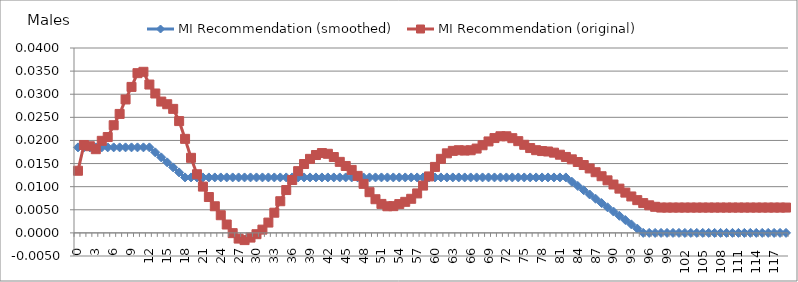
| Category | MI Recommendation (smoothed) | MI Recommendation (original)  |
|---|---|---|
| 0.0 | 0.018 | 0.013 |
| 1.0 | 0.018 | 0.019 |
| 2.0 | 0.018 | 0.019 |
| 3.0 | 0.018 | 0.018 |
| 4.0 | 0.018 | 0.02 |
| 5.0 | 0.018 | 0.021 |
| 6.0 | 0.018 | 0.023 |
| 7.0 | 0.018 | 0.026 |
| 8.0 | 0.018 | 0.029 |
| 9.0 | 0.018 | 0.032 |
| 10.0 | 0.018 | 0.035 |
| 11.0 | 0.018 | 0.035 |
| 12.0 | 0.018 | 0.032 |
| 13.0 | 0.017 | 0.03 |
| 14.0 | 0.016 | 0.028 |
| 15.0 | 0.015 | 0.028 |
| 16.0 | 0.014 | 0.027 |
| 17.0 | 0.013 | 0.024 |
| 18.0 | 0.012 | 0.02 |
| 19.0 | 0.012 | 0.016 |
| 20.0 | 0.012 | 0.013 |
| 21.0 | 0.012 | 0.01 |
| 22.0 | 0.012 | 0.008 |
| 23.0 | 0.012 | 0.006 |
| 24.0 | 0.012 | 0.004 |
| 25.0 | 0.012 | 0.002 |
| 26.0 | 0.012 | 0 |
| 27.0 | 0.012 | -0.001 |
| 28.0 | 0.012 | -0.002 |
| 29.0 | 0.012 | -0.001 |
| 30.0 | 0.012 | 0 |
| 31.0 | 0.012 | 0.001 |
| 32.0 | 0.012 | 0.002 |
| 33.0 | 0.012 | 0.004 |
| 34.0 | 0.012 | 0.007 |
| 35.0 | 0.012 | 0.009 |
| 36.0 | 0.012 | 0.011 |
| 37.0 | 0.012 | 0.013 |
| 38.0 | 0.012 | 0.015 |
| 39.0 | 0.012 | 0.016 |
| 40.0 | 0.012 | 0.017 |
| 41.0 | 0.012 | 0.017 |
| 42.0 | 0.012 | 0.017 |
| 43.0 | 0.012 | 0.016 |
| 44.0 | 0.012 | 0.015 |
| 45.0 | 0.012 | 0.014 |
| 46.0 | 0.012 | 0.014 |
| 47.0 | 0.012 | 0.012 |
| 48.0 | 0.012 | 0.011 |
| 49.0 | 0.012 | 0.009 |
| 50.0 | 0.012 | 0.007 |
| 51.0 | 0.012 | 0.006 |
| 52.0 | 0.012 | 0.006 |
| 53.0 | 0.012 | 0.006 |
| 54.0 | 0.012 | 0.006 |
| 55.0 | 0.012 | 0.007 |
| 56.0 | 0.012 | 0.007 |
| 57.0 | 0.012 | 0.009 |
| 58.0 | 0.012 | 0.01 |
| 59.0 | 0.012 | 0.012 |
| 60.0 | 0.012 | 0.014 |
| 61.0 | 0.012 | 0.016 |
| 62.0 | 0.012 | 0.017 |
| 63.0 | 0.012 | 0.018 |
| 64.0 | 0.012 | 0.018 |
| 65.0 | 0.012 | 0.018 |
| 66.0 | 0.012 | 0.018 |
| 67.0 | 0.012 | 0.018 |
| 68.0 | 0.012 | 0.019 |
| 69.0 | 0.012 | 0.02 |
| 70.0 | 0.012 | 0.021 |
| 71.0 | 0.012 | 0.021 |
| 72.0 | 0.012 | 0.021 |
| 73.0 | 0.012 | 0.02 |
| 74.0 | 0.012 | 0.02 |
| 75.0 | 0.012 | 0.019 |
| 76.0 | 0.012 | 0.018 |
| 77.0 | 0.012 | 0.018 |
| 78.0 | 0.012 | 0.018 |
| 79.0 | 0.012 | 0.018 |
| 80.0 | 0.012 | 0.017 |
| 81.0 | 0.012 | 0.017 |
| 82.0 | 0.012 | 0.016 |
| 83.0 | 0.011 | 0.016 |
| 84.0 | 0.01 | 0.015 |
| 85.0 | 0.009 | 0.015 |
| 86.0 | 0.008 | 0.014 |
| 87.0 | 0.007 | 0.013 |
| 88.0 | 0.006 | 0.012 |
| 89.0 | 0.006 | 0.011 |
| 90.0 | 0.005 | 0.01 |
| 91.0 | 0.004 | 0.01 |
| 92.0 | 0.003 | 0.009 |
| 93.0 | 0.002 | 0.008 |
| 94.0 | 0.001 | 0.007 |
| 95.0 | 0 | 0.006 |
| 96.0 | 0 | 0.006 |
| 97.0 | 0 | 0.006 |
| 98.0 | 0 | 0.005 |
| 99.0 | 0 | 0.005 |
| 100.0 | 0 | 0.005 |
| 101.0 | 0 | 0.005 |
| 102.0 | 0 | 0.005 |
| 103.0 | 0 | 0.005 |
| 104.0 | 0 | 0.005 |
| 105.0 | 0 | 0.005 |
| 106.0 | 0 | 0.005 |
| 107.0 | 0 | 0.005 |
| 108.0 | 0 | 0.005 |
| 109.0 | 0 | 0.005 |
| 110.0 | 0 | 0.005 |
| 111.0 | 0 | 0.005 |
| 112.0 | 0 | 0.005 |
| 113.0 | 0 | 0.005 |
| 114.0 | 0 | 0.005 |
| 115.0 | 0 | 0.005 |
| 116.0 | 0 | 0.005 |
| 117.0 | 0 | 0.005 |
| 118.0 | 0 | 0.005 |
| 119.0 | 0 | 0.005 |